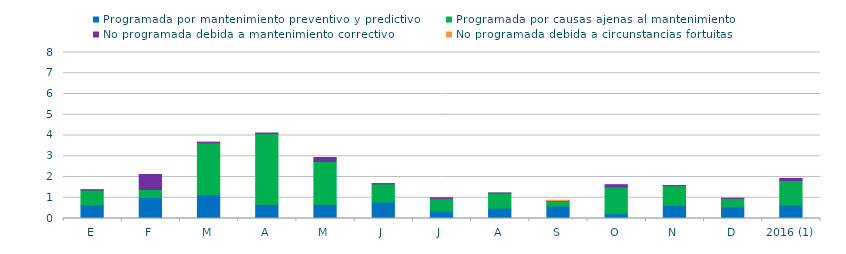
| Category | Programada por mantenimiento preventivo y predictivo | Programada por causas ajenas al mantenimiento  | No programada debida a mantenimiento correctivo  | No programada debida a circunstancias fortuitas  |
|---|---|---|---|---|
| E | 0.65 | 0.72 | 0.02 | 0 |
| F | 1.01 | 0.39 | 0.72 | 0 |
| M | 1.15 | 2.5 | 0.03 | 0 |
| A | 0.68 | 3.41 | 0.03 | 0 |
| M | 0.68 | 2.07 | 0.19 | 0 |
| J | 0.79 | 0.88 | 0.01 | 0 |
| J | 0.36 | 0.6 | 0.04 | 0 |
| A | 0.5 | 0.72 | 0.01 | 0 |
| S | 0.6 | 0.24 | 0.02 | 0.02 |
| O | 0.23 | 1.29 | 0.11 | 0 |
| N | 0.64 | 0.94 | 0.01 | 0 |
| D | 0.56 | 0.41 | 0.01 | 0 |
| 2016 (1) | 0.65 | 1.18 | 0.1 | 0 |